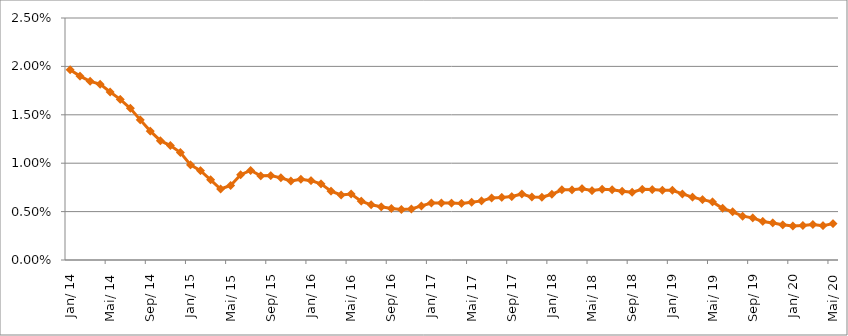
| Category | Durchschnittszins |
|---|---|
| 2014-01-01 | 0.02 |
| 2014-02-01 | 0.019 |
| 2014-03-01 | 0.018 |
| 2014-04-01 | 0.018 |
| 2014-05-01 | 0.017 |
| 2014-06-01 | 0.017 |
| 2014-07-01 | 0.016 |
| 2014-08-01 | 0.014 |
| 2014-09-01 | 0.013 |
| 2014-10-01 | 0.012 |
| 2014-11-01 | 0.012 |
| 2014-12-01 | 0.011 |
| 2015-01-01 | 0.01 |
| 2015-02-01 | 0.009 |
| 2015-03-01 | 0.008 |
| 2015-04-01 | 0.007 |
| 2015-05-01 | 0.008 |
| 2015-06-01 | 0.009 |
| 2015-07-01 | 0.009 |
| 2015-08-01 | 0.009 |
| 2015-09-01 | 0.009 |
| 2015-10-01 | 0.008 |
| 2015-11-01 | 0.008 |
| 2015-12-01 | 0.008 |
| 2016-01-01 | 0.008 |
| 2016-02-01 | 0.008 |
| 2016-03-01 | 0.007 |
| 2016-04-01 | 0.007 |
| 2016-05-01 | 0.007 |
| 2016-06-01 | 0.006 |
| 2016-07-01 | 0.006 |
| 2016-08-01 | 0.005 |
| 2016-09-01 | 0.005 |
| 2016-10-01 | 0.005 |
| 2016-11-01 | 0.005 |
| 2016-12-01 | 0.006 |
| 2017-01-01 | 0.006 |
| 2017-02-01 | 0.006 |
| 2017-03-01 | 0.006 |
| 2017-04-01 | 0.006 |
| 2017-05-01 | 0.006 |
| 2017-06-01 | 0.006 |
| 2017-07-01 | 0.006 |
| 2017-08-01 | 0.006 |
| 2017-09-01 | 0.007 |
| 2017-10-01 | 0.007 |
| 2017-11-01 | 0.007 |
| 2017-12-01 | 0.006 |
| 2018-01-01 | 0.007 |
| 2018-02-01 | 0.007 |
| 2018-03-01 | 0.007 |
| 2018-04-01 | 0.007 |
| 2018-05-01 | 0.007 |
| 2018-06-01 | 0.007 |
| 2018-07-01 | 0.007 |
| 2018-08-01 | 0.007 |
| 2018-09-01 | 0.007 |
| 2018-10-01 | 0.007 |
| 2018-11-01 | 0.007 |
| 2018-12-01 | 0.007 |
| 2019-01-01 | 0.007 |
| 2019-02-01 | 0.007 |
| 2019-03-01 | 0.006 |
| 2019-04-01 | 0.006 |
| 2019-05-01 | 0.006 |
| 2019-06-01 | 0.005 |
| 2019-07-01 | 0.005 |
| 2019-08-01 | 0.005 |
| 2019-09-01 | 0.004 |
| 2019-10-01 | 0.004 |
| 2019-11-01 | 0.004 |
| 2019-12-01 | 0.004 |
| 2020-01-01 | 0.004 |
| 2020-02-01 | 0.004 |
| 2020-03-01 | 0.004 |
| 2020-04-01 | 0.004 |
| 2020-05-01 | 0.004 |